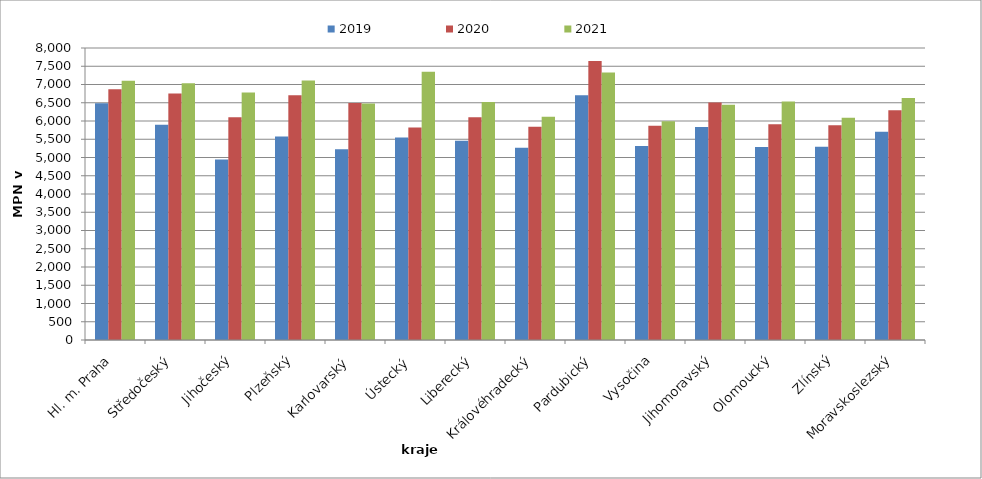
| Category | 2019 | 2020 | 2021 |
|---|---|---|---|
| Hl. m. Praha | 6489 | 6871 | 7100 |
| Středočeský | 5898 | 6756 | 7035 |
| Jihočeský | 4943 | 6100 | 6778 |
| Plzeňský | 5576 | 6707 | 7112 |
| Karlovarský  | 5229 | 6493 | 6481 |
| Ústecký   | 5548 | 5819 | 7350 |
| Liberecký | 5456 | 6100 | 6521 |
| Královéhradecký | 5264 | 5843 | 6115 |
| Pardubický | 6705 | 7643 | 7331 |
| Vysočina | 5318 | 5867 | 5991 |
| Jihomoravský | 5837 | 6509 | 6444 |
| Olomoucký | 5285 | 5909 | 6532 |
| Zlínský | 5292 | 5884 | 6089 |
| Moravskoslezský | 5705 | 6296 | 6633 |